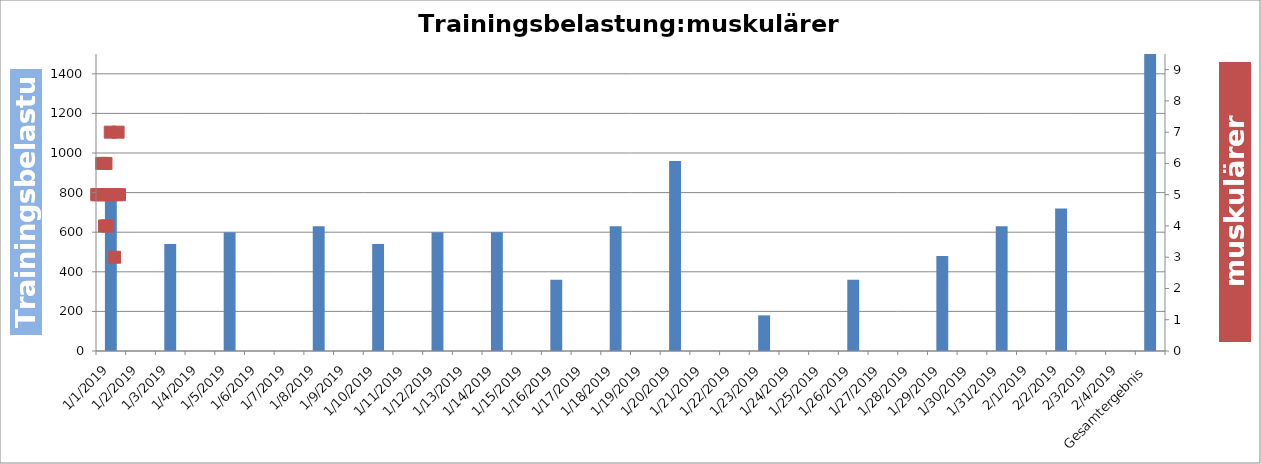
| Category | Series 0 |
|---|---|
| 01.01.19 | 810 |
| 02.01.19 | 0 |
| 03.01.19 | 540 |
| 04.01.19 | 0 |
| 05.01.19 | 600 |
| 06.01.19 | 0 |
| 07.01.19 | 0 |
| 08.01.19 | 630 |
| 09.01.19 | 0 |
| 10.01.19 | 540 |
| 11.01.19 | 0 |
| 12.01.19 | 600 |
| 13.01.19 | 0 |
| 14.01.19 | 600 |
| 15.01.19 | 0 |
| 16.01.19 | 360 |
| 17.01.19 | 0 |
| 18.01.19 | 630 |
| 19.01.19 | 0 |
| 20.01.19 | 960 |
| 21.01.19 | 0 |
| 22.01.19 | 0 |
| 23.01.19 | 180 |
| 24.01.19 | 0 |
| 25.01.19 | 0 |
| 26.01.19 | 360 |
| 27.01.19 | 0 |
| 28.01.19 | 0 |
| 29.01.19 | 480 |
| 30.01.19 | 0 |
| 31.01.19 | 630 |
| 01.02.19 | 0 |
| 02.02.19 | 720 |
| 03.02.19 | 0 |
| 04.02.19 | 0 |
| Gesamtergebnis | 8640 |